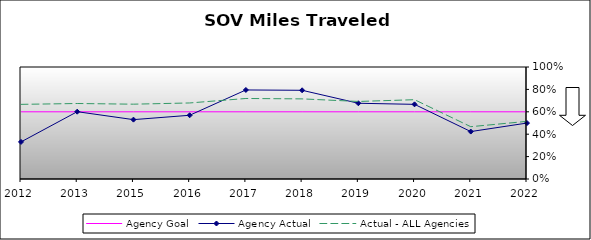
| Category | Agency Goal | Agency Actual | Actual - ALL Agencies |
|---|---|---|---|
| 2012.0 | 0.6 | 0.331 | 0.666 |
| 2013.0 | 0.6 | 0.601 | 0.674 |
| 2015.0 | 0.6 | 0.53 | 0.668 |
| 2016.0 | 0.6 | 0.569 | 0.679 |
| 2017.0 | 0.6 | 0.795 | 0.719 |
| 2018.0 | 0.6 | 0.792 | 0.715 |
| 2019.0 | 0.6 | 0.676 | 0.692 |
| 2020.0 | 0.6 | 0.666 | 0.708 |
| 2021.0 | 0.6 | 0.424 | 0.467 |
| 2022.0 | 0.6 | 0.5 | 0.515 |